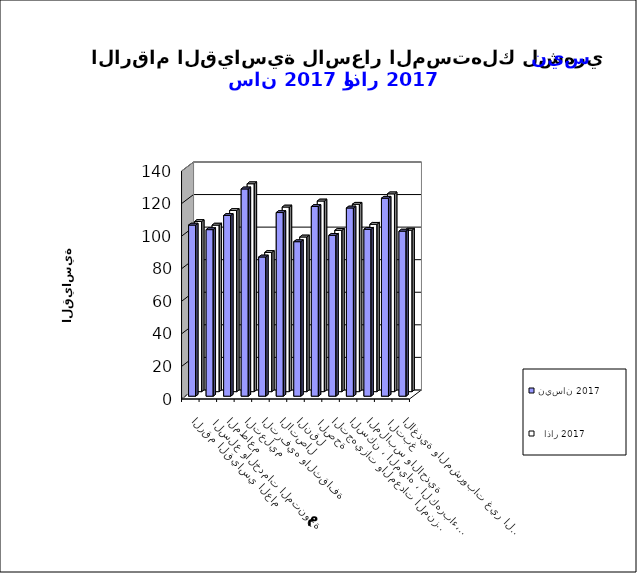
| Category | نيسان 2017      |   اذار 2017       |
|---|---|---|
| الاغذية والمشروبات غير الكحولية | 101.4 | 99.2 |
|  التبغ | 121.6 | 121.5 |
| الملابس والاحذية | 102.5 | 102.8 |
| السكن ، المياه ، الكهرباء، الغاز  | 115.6 | 115.1 |
| التجهيزات والمعدات المنزلية والصيانة | 98.8 | 99.1 |
|  الصحة | 116.5 | 117.1 |
| النقل | 94.9 | 95 |
| الاتصال | 112.8 | 113.4 |
| الترفيه والثقافة | 85.5 | 85.5 |
| التعليم | 127.3 | 127.7 |
| المطاعم  | 111 | 111.3 |
|  السلع والخدمات المتنوعة | 102.3 | 102.3 |
| الرقم القياسي العام | 105.1 | 104.5 |